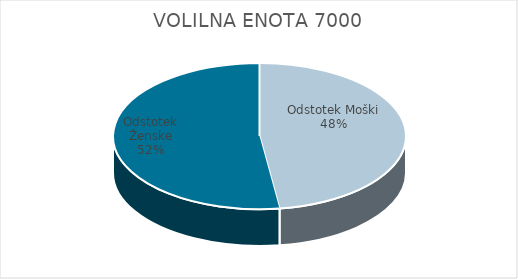
| Category | VOLILNA ENOTA 7000 | #REF! | Slovenija skupaj |
|---|---|---|---|
| Odstotek Moški | 23.64 |  | 25.28 |
| Odstotek Ženske | 25.79 |  | 27.73 |